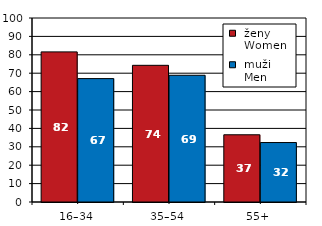
| Category |  ženy 
 Women |  muži 
 Men |
|---|---|---|
| 16–34 | 81.585 | 67.063 |
| 35–54 | 74.282 | 68.877 |
| 55+  | 36.532 | 32.312 |